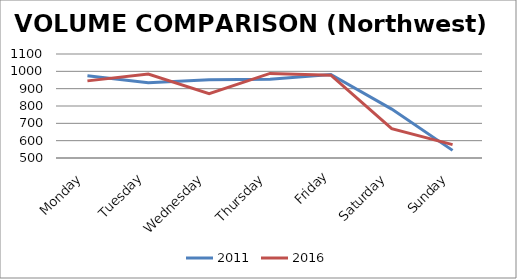
| Category | 2011 | 2016 |
|---|---|---|
| Monday | 974 | 945 |
| Tuesday | 934 | 984 |
| Wednesday | 952 | 871 |
| Thursday | 954 | 988 |
| Friday | 982 | 978 |
| Saturday | 782 | 669 |
| Sunday | 544 | 577 |